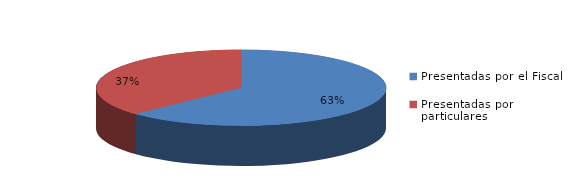
| Category | Series 0 |
|---|---|
| Presentadas por el Fiscal | 1565 |
| Presentadas por particulares | 924 |